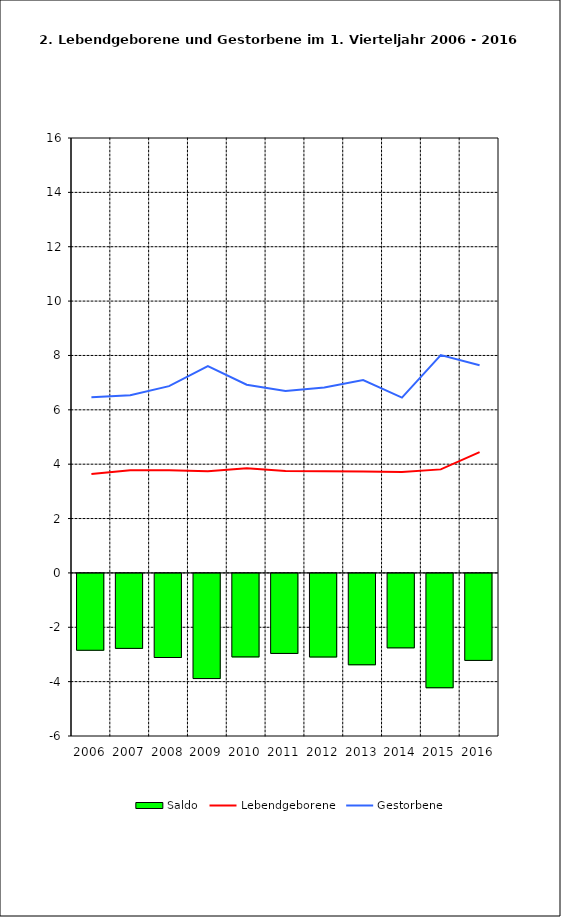
| Category | Saldo |
|---|---|
| 2005.0 | -2.828 |
| 2006.0 | -2.758 |
| 2007.0 | -3.094 |
| 2008.0 | -3.869 |
| 2009.0 | -3.071 |
| 2010.0 | -2.944 |
| 2011.0 | -3.075 |
| 2012.0 | -3.361 |
| 2013.0 | -2.739 |
| 2014.0 | -4.206 |
| 2015.0 | -3.2 |